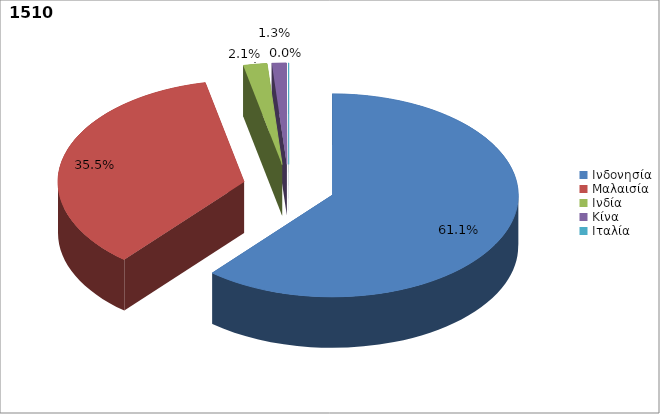
| Category | Series 0 |
|---|---|
| Ινδονησία | 0.611 |
| Μαλαισία | 0.355 |
| Ινδία | 0.021 |
| Κίνα | 0.013 |
| Ιταλία | 0 |